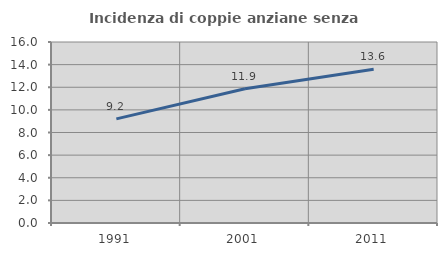
| Category | Incidenza di coppie anziane senza figli  |
|---|---|
| 1991.0 | 9.207 |
| 2001.0 | 11.869 |
| 2011.0 | 13.6 |